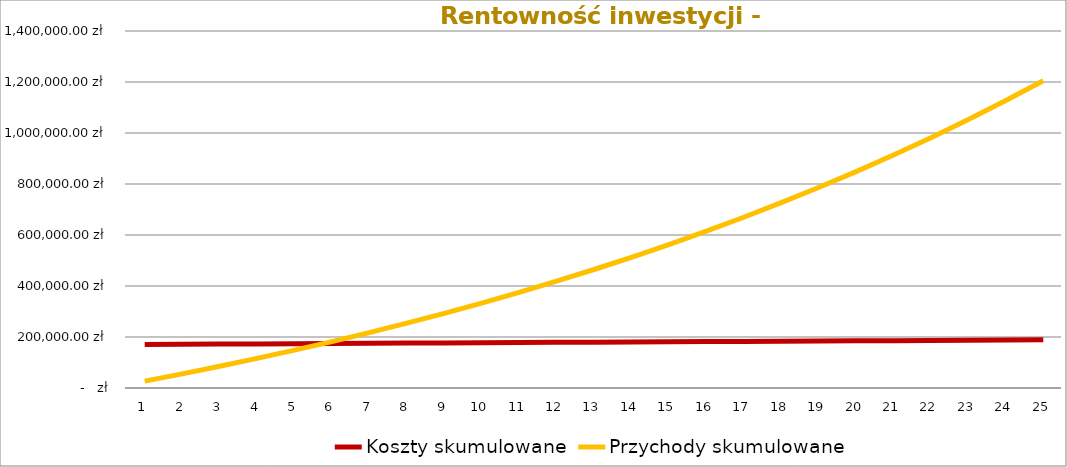
| Category | Koszty skumulowane | Przychody skumulowane |
|---|---|---|
| 0 | 170750 | 27122.238 |
| 1 | 171500 | 55458.196 |
| 2 | 172250 | 85062.188 |
| 3 | 173000 | 115990.959 |
| 4 | 173750 | 148303.793 |
| 5 | 174500 | 182062.626 |
| 6 | 175250 | 217332.166 |
| 7 | 176000 | 254180.018 |
| 8 | 176750 | 292676.812 |
| 9 | 177500 | 332896.338 |
| 10 | 178250 | 374915.687 |
| 11 | 179000 | 418815.402 |
| 12 | 179750 | 464679.629 |
| 13 | 180500 | 512596.28 |
| 14 | 181250 | 562657.202 |
| 15 | 182000 | 614958.35 |
| 16 | 182750 | 669599.974 |
| 17 | 183500 | 726686.811 |
| 18 | 184250 | 786328.283 |
| 19 | 185000 | 848638.712 |
| 20 | 185750 | 913737.532 |
| 21 | 186500 | 981749.525 |
| 22 | 187250 | 1052805.054 |
| 23 | 188000 | 1127040.318 |
| 24 | 188750 | 1204597.611 |